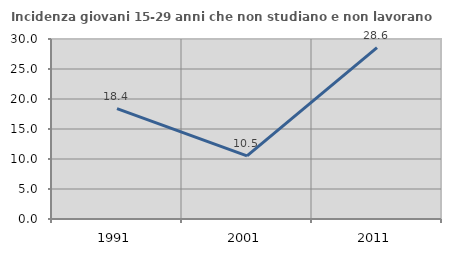
| Category | Incidenza giovani 15-29 anni che non studiano e non lavorano  |
|---|---|
| 1991.0 | 18.41 |
| 2001.0 | 10.526 |
| 2011.0 | 28.571 |